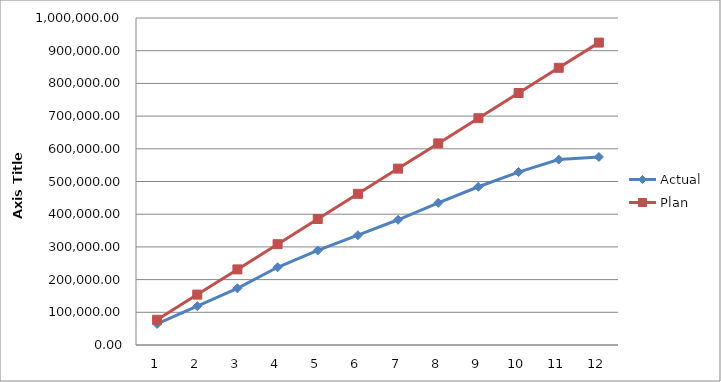
| Category | Actual | Plan |
|---|---|---|
| 0 | 64373.22 | 77062.5 |
| 1 | 118688.93 | 154125 |
| 2 | 173425.67 | 231187.5 |
| 3 | 237660.79 | 308250 |
| 4 | 289095.32 | 385312.5 |
| 5 | 335714.28 | 462375 |
| 6 | 382979.34 | 539437.5 |
| 7 | 434728.76 | 616500 |
| 8 | 483907.62 | 693562.5 |
| 9 | 528871.57 | 770625 |
| 10 | 567025.2 | 847687.5 |
| 11 | 575054.59 | 924750 |